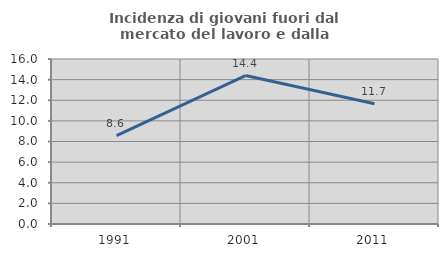
| Category | Incidenza di giovani fuori dal mercato del lavoro e dalla formazione  |
|---|---|
| 1991.0 | 8.562 |
| 2001.0 | 14.391 |
| 2011.0 | 11.66 |